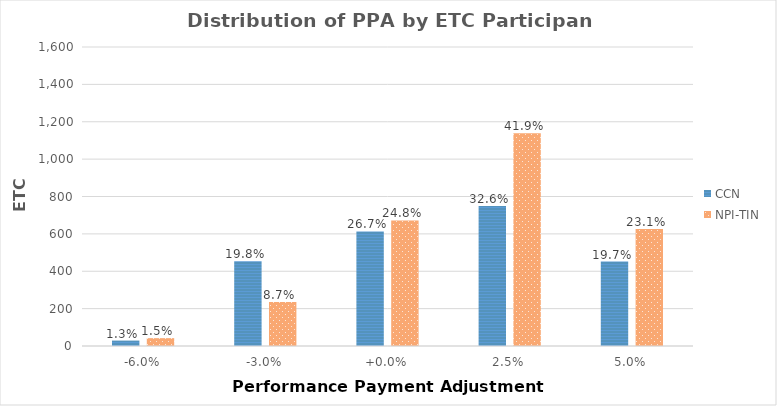
| Category | CCN | NPI-TIN |
|---|---|---|
| -6.0% | 29 | 42 |
| -3.0% | 454 | 236 |
| +0.0% | 613 | 672 |
| 2.5% | 749 | 1138 |
| 5.0% | 452 | 626 |